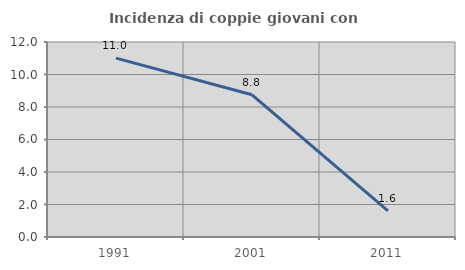
| Category | Incidenza di coppie giovani con figli |
|---|---|
| 1991.0 | 11.009 |
| 2001.0 | 8.75 |
| 2011.0 | 1.613 |